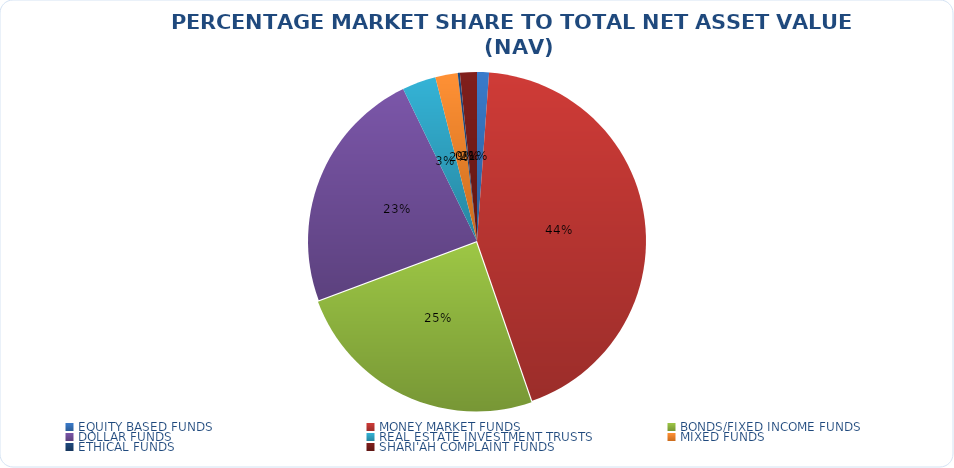
| Category | NET ASSET VALUE |
|---|---|
| EQUITY BASED FUNDS | 16107237306.71 |
| MONEY MARKET FUNDS | 614697197461.63 |
| BONDS/FIXED INCOME FUNDS | 347146151227.324 |
| DOLLAR FUNDS | 331525669640.76 |
| REAL ESTATE INVESTMENT TRUSTS | 45655500617.02 |
| MIXED FUNDS | 30126566651.347 |
| ETHICAL FUNDS | 2949746784.85 |
| SHARI'AH COMPLAINT FUNDS | 22836936554.24 |